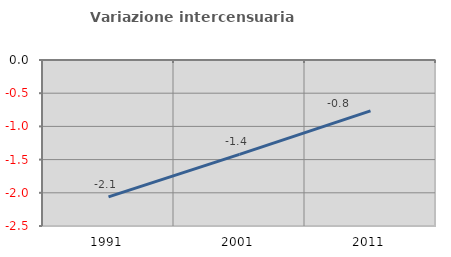
| Category | Variazione intercensuaria annua |
|---|---|
| 1991.0 | -2.062 |
| 2001.0 | -1.42 |
| 2011.0 | -0.766 |